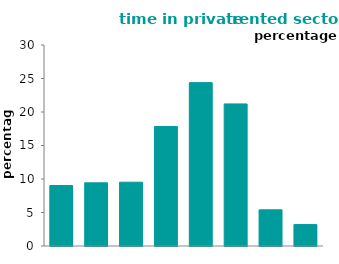
| Category | time in private rented sector |
|---|---|
| <1 
year | 9.022 |
| 1 
year | 9.425 |
| 2 
years | 9.523 |
| 3-4 
years | 17.838 |
| 5-9 
years | 24.383 |
| 10-19 
years | 21.208 |
| 20-29 
years | 5.402 |
| 30+ 
years | 3.199 |